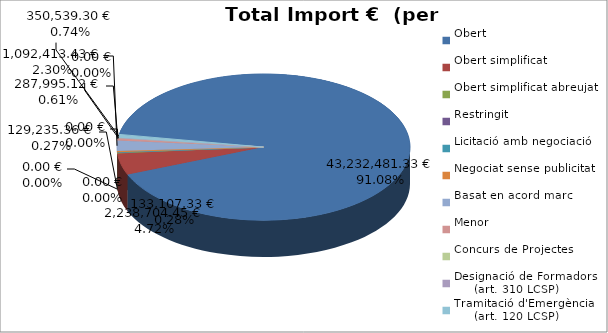
| Category | Total preu
(amb IVA) |
|---|---|
| Obert | 43232481.326 |
| Obert simplificat | 2238704.454 |
| Obert simplificat abreujat | 133107.333 |
| Restringit | 0 |
| Licitació amb negociació | 0 |
| Negociat sense publicitat | 129235.357 |
| Basat en acord marc | 1092413.434 |
| Menor | 287995.12 |
| Concurs de Projectes | 0 |
| Designació de Formadors
     (art. 310 LCSP) | 0 |
| Tramitació d'Emergència
     (art. 120 LCSP) | 350539.299 |